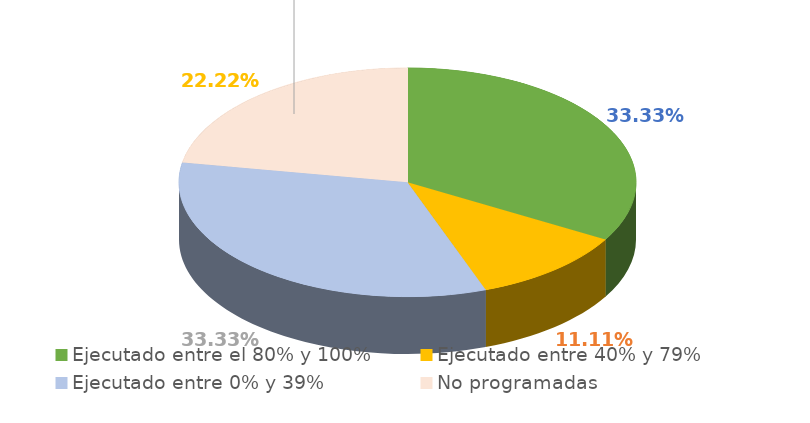
| Category | Series 0 |
|---|---|
| Ejecutado entre el 80% y 100% | 0.333 |
| Ejecutado entre 40% y 79% | 0.111 |
| Ejecutado entre 0% y 39% | 0.333 |
| No programadas | 0.222 |